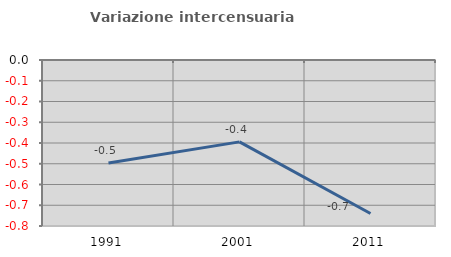
| Category | Variazione intercensuaria annua |
|---|---|
| 1991.0 | -0.496 |
| 2001.0 | -0.395 |
| 2011.0 | -0.74 |